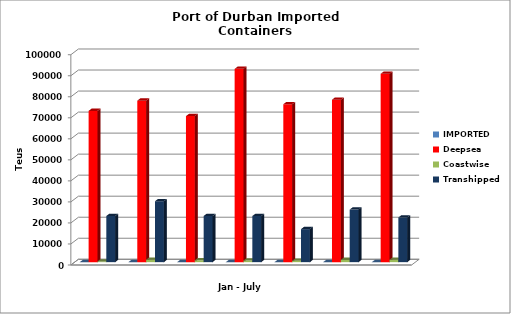
| Category | IMPORTED | Deepsea | Coastwise | Transhipped |
|---|---|---|---|---|
|  | 0 | 71938 | 332 | 21954 |
|  | 0 | 76807 | 1163 | 28970 |
|  | 0 | 69450 | 875 | 21959 |
|  | 0 | 91933 | 775 | 21934 |
|  | 0 | 75101 | 617 | 15714 |
|  | 0 | 77263 | 1072 | 25015 |
|  | 0 | 89575 | 1146 | 21248 |